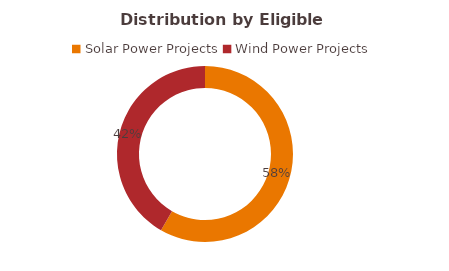
| Category | Solar Power Projects |
|---|---|
| Solar Power Projects | 0.583 |
| Wind Power Projects | 0.417 |